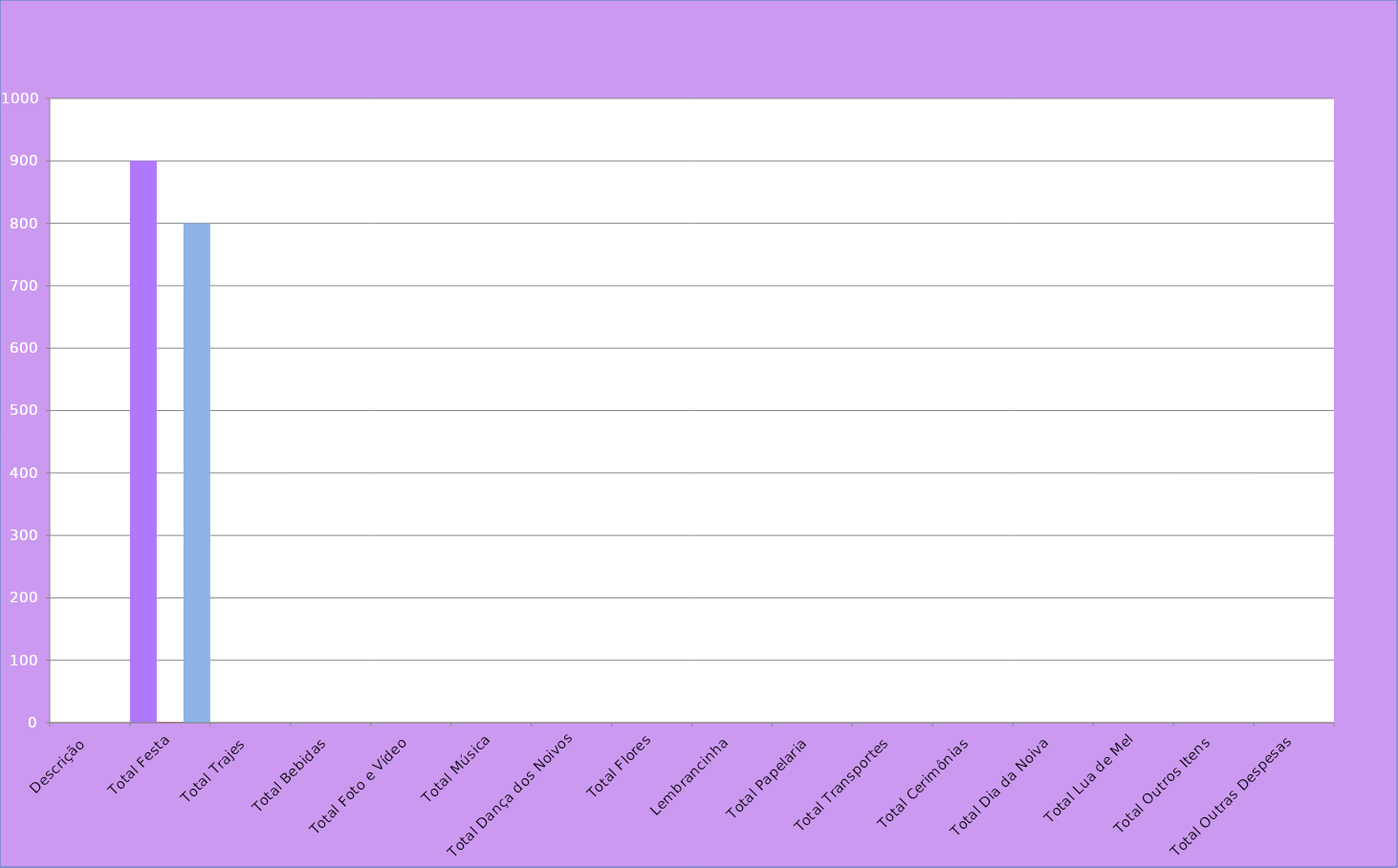
| Category | Series 0 | Series 1 | Series 2 |
|---|---|---|---|
| Descrição | 0 | 0 | 0 |
| Total Festa | 900 | 1 | 800 |
| Total Trajes | 0 | 0 | 0 |
| Total Bebidas | 0 | 0 | 0 |
| Total Foto e Vídeo | 0 | 0 | 0 |
| Total Música | 0 | 0 | 0 |
| Total Dança dos Noivos | 0 | 0 | 0 |
| Total Flores | 0 | 0 | 0 |
| Lembrancinha | 0 | 0 | 0 |
| Total Papelaria | 0 | 0 | 0 |
| Total Transportes | 0 | 0 | 0 |
| Total Cerimônias | 0 | 0 | 0 |
| Total Dia da Noiva | 0 | 0 | 0 |
| Total Lua de Mel | 0 | 0 | 0 |
| Total Outros Itens | 0 | 0 | 0 |
| Total Outras Despesas | 0 | 0 | 0 |